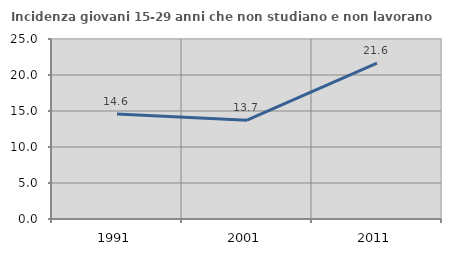
| Category | Incidenza giovani 15-29 anni che non studiano e non lavorano  |
|---|---|
| 1991.0 | 14.572 |
| 2001.0 | 13.725 |
| 2011.0 | 21.633 |